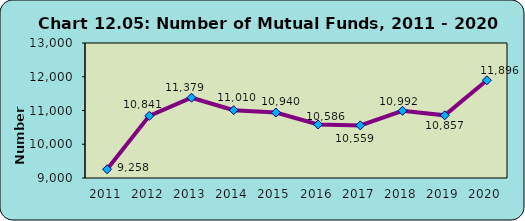
| Category | Mutual Funds |
|---|---|
| 2011.0 | 9258 |
| 2012.0 | 10841 |
| 2013.0 | 11379 |
| 2014.0 | 11010 |
| 2015.0 | 10940 |
| 2016.0 | 10586 |
| 2017.0 | 10559 |
| 2018.0 | 10992 |
| 2019.0 | 10857 |
| 2020.0 | 11896 |